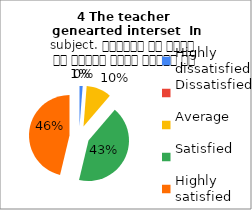
| Category | 4 The teacher 
genearted interset  In subject. शिक्षक ने विषय के प्रति रुचि जागृत की |
|---|---|
| Highly dissatisfied | 1 |
| Dissatisfied | 0 |
| Average | 8 |
| Satisfied | 34 |
| Highly satisfied | 37 |